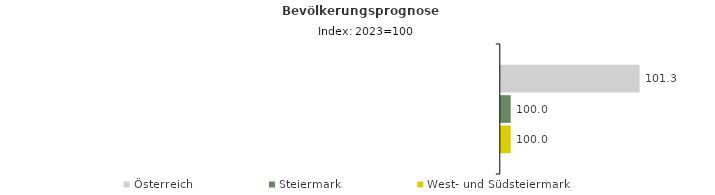
| Category | Österreich | Steiermark | West- und Südsteiermark |
|---|---|---|---|
| 2023.0 | 101.3 | 100 | 100 |